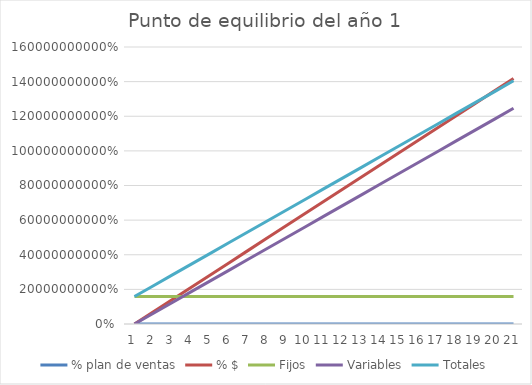
| Category | % plan de ventas | % $ | Fijos | Variables | Totales |
|---|---|---|---|---|---|
| 0 | 0 | 0 | 158917161.816 | 0 | 158917161.816 |
| 1 | 0.05 | 70875000 | 158917161.816 | 62290558.597 | 221207720.413 |
| 2 | 0.1 | 141750000 | 158917161.816 | 124581117.194 | 283498279.01 |
| 3 | 0.15 | 212625000 | 158917161.816 | 186871675.79 | 345788837.606 |
| 4 | 0.2 | 283500000 | 158917161.816 | 249162234.387 | 408079396.203 |
| 5 | 0.25 | 354375000 | 158917161.816 | 311452792.984 | 470369954.8 |
| 6 | 0.3 | 425250000 | 158917161.816 | 373743351.581 | 532660513.397 |
| 7 | 0.35 | 496125000 | 158917161.816 | 436033910.178 | 594951071.993 |
| 8 | 0.4 | 567000000 | 158917161.816 | 498324468.774 | 657241630.59 |
| 9 | 0.45 | 637875000 | 158917161.816 | 560615027.371 | 719532189.187 |
| 10 | 0.5 | 708750000 | 158917161.816 | 622905585.968 | 781822747.784 |
| 11 | 0.55 | 779625000 | 158917161.816 | 685196144.565 | 844113306.381 |
| 12 | 0.6 | 850500000 | 158917161.816 | 747486703.161 | 906403864.977 |
| 13 | 0.65 | 921375000 | 158917161.816 | 809777261.758 | 968694423.574 |
| 14 | 0.7 | 992250000 | 158917161.816 | 872067820.355 | 1030984982.171 |
| 15 | 0.75 | 1063125000 | 158917161.816 | 934358378.952 | 1093275540.768 |
| 16 | 0.8 | 1134000000 | 158917161.816 | 996648937.549 | 1155566099.365 |
| 17 | 0.85 | 1204875000 | 158917161.816 | 1058939496.145 | 1217856657.961 |
| 18 | 0.9 | 1275750000 | 158917161.816 | 1121230054.742 | 1280147216.558 |
| 19 | 0.95 | 1346625000 | 158917161.816 | 1183520613.339 | 1342437775.155 |
| 20 | 1 | 1417500000 | 158917161.816 | 1245811171.936 | 1404728333.752 |